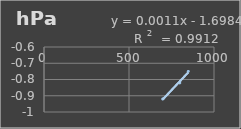
| Category | Presión Atmosférica |
|---|---|
| 698.3 | -0.92 |
| 798.4 | -0.821 |
| 848.7 | -0.75 |